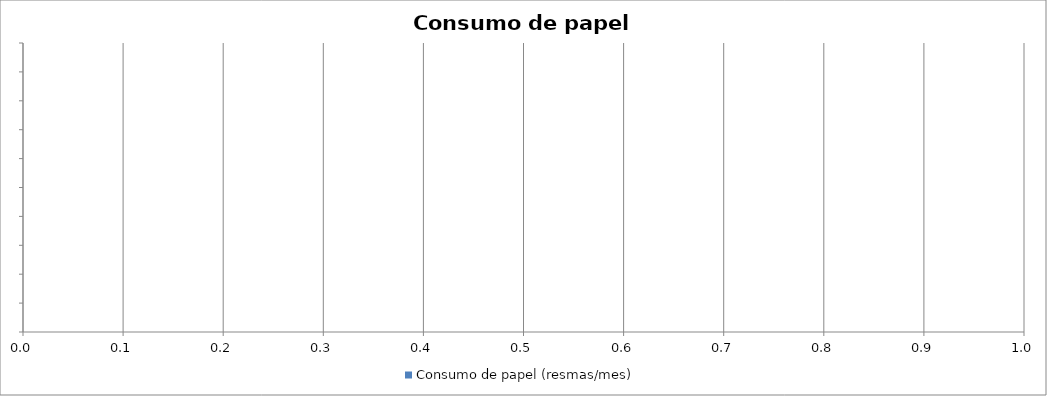
| Category | Consumo de papel (resmas/mes) |
|---|---|
| 0 | 0 |
| 1 | 0 |
| 2 | 0 |
| 3 | 0 |
| 4 | 0 |
| 5 | 0 |
| 6 | 0 |
| 7 | 0 |
| 8 | 0 |
| 9 | 0 |